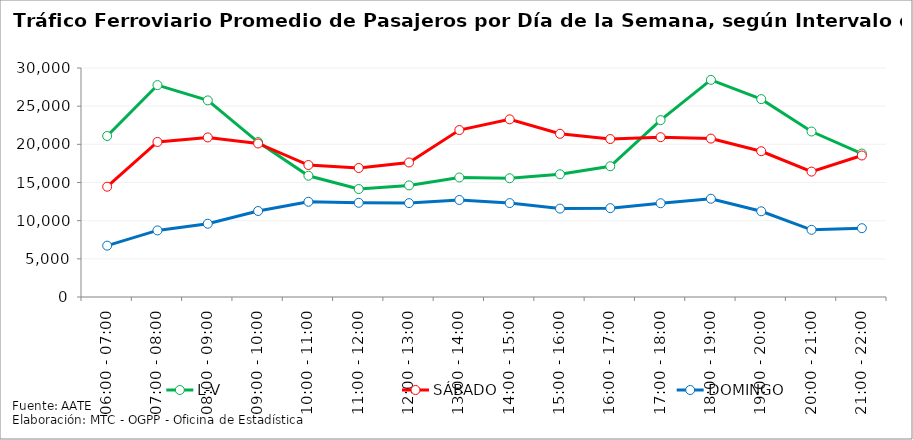
| Category | L-V | SÁBADO | DOMINGO |
|---|---|---|---|
| 06:00 - 07:00 | 21092 | 14451 | 6727 |
| 07:00 - 08:00 | 27759 | 20311 | 8723 |
| 08:00 - 09:00 | 25757 | 20906 | 9598 |
| 09:00 - 10:00 | 20300 | 20110 | 11265 |
| 10:00 - 11:00 | 15884 | 17292 | 12475 |
| 11:00 - 12:00 | 14143 | 16899 | 12340 |
| 12:00 - 13:00 | 14620 | 17622 | 12300 |
| 13:00 - 14:00 | 15656 | 21871 | 12711 |
| 14:00 - 15:00 | 15558 | 23275 | 12303 |
| 15:00 - 16:00 | 16077 | 21381 | 11581 |
| 16:00 - 17:00 | 17130 | 20695 | 11641 |
| 17:00 - 18:00 | 23174 | 20936 | 12283 |
| 18:00 - 19:00 | 28445 | 20753 | 12875 |
| 19:00 - 20:00 | 25923 | 19095 | 11229 |
| 20:00 - 21:00 | 21678 | 16426 | 8799 |
| 21:00 - 22:00 | 18793 | 18538 | 9015 |